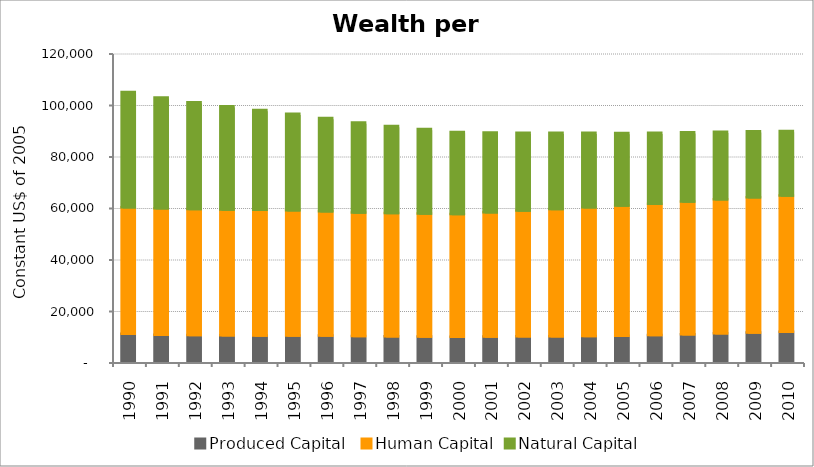
| Category | Produced Capital  | Human Capital | Natural Capital |
|---|---|---|---|
| 1990.0 | 10890.036 | 49129.125 | 44768.117 |
| 1991.0 | 10524.214 | 49039.744 | 43016.573 |
| 1992.0 | 10367.867 | 48937.312 | 41464.848 |
| 1993.0 | 10257.186 | 48897.863 | 40069.683 |
| 1994.0 | 10209.554 | 48793.249 | 38752.032 |
| 1995.0 | 10166.462 | 48649.962 | 37477.611 |
| 1996.0 | 10154.457 | 48270.978 | 36201.225 |
| 1997.0 | 10002.055 | 47947.694 | 34971.75 |
| 1998.0 | 9895.35 | 47858.282 | 33815.262 |
| 1999.0 | 9822.538 | 47780.432 | 32761.868 |
| 2000.0 | 9714.737 | 47710.095 | 31823.368 |
| 2001.0 | 9803.553 | 48262.617 | 30993.394 |
| 2002.0 | 9889.956 | 48815.712 | 30251.814 |
| 2003.0 | 9940.718 | 49378.721 | 29568.055 |
| 2004.0 | 10018.071 | 49959.445 | 28906.785 |
| 2005.0 | 10097.816 | 50534.4 | 28245.837 |
| 2006.0 | 10344.678 | 51042.102 | 27580.476 |
| 2007.0 | 10656.43 | 51546.141 | 26914.925 |
| 2008.0 | 11048.634 | 52041.449 | 26264.232 |
| 2009.0 | 11385.648 | 52461.88 | 25635.1 |
| 2010.0 | 11697.495 | 52878.933 | 25034.092 |